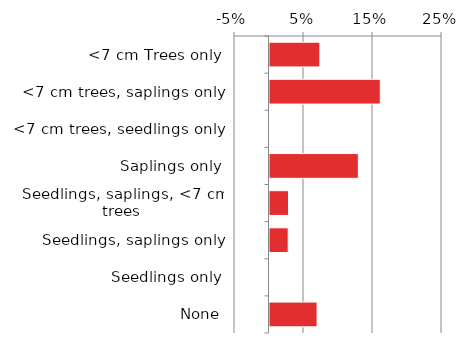
| Category | Non native |
|---|---|
| None | 0.07 |
| Seedlings only | 0 |
| Seedlings, saplings only | 0.029 |
| Seedlings, saplings, <7 cm trees | 0.029 |
| Saplings only | 0.13 |
| <7 cm trees, seedlings only | 0 |
| <7 cm trees, saplings only | 0.162 |
| <7 cm Trees only | 0.074 |